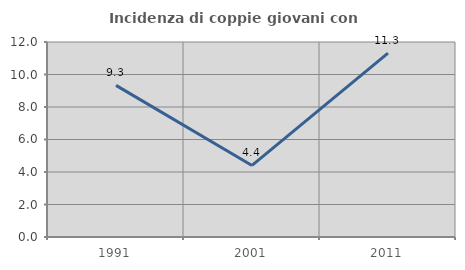
| Category | Incidenza di coppie giovani con figli |
|---|---|
| 1991.0 | 9.329 |
| 2001.0 | 4.403 |
| 2011.0 | 11.315 |